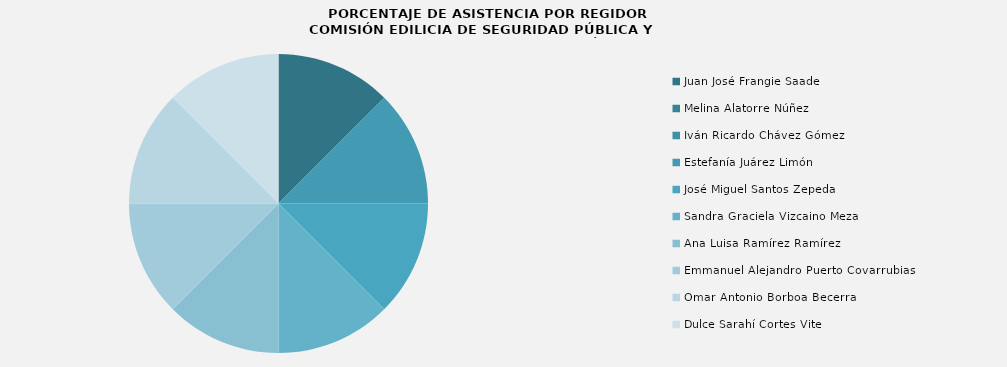
| Category | Series 0 |
|---|---|
| Juan José Frangie Saade | 100 |
| Melina Alatorre Núñez | 0 |
| Iván Ricardo Chávez Gómez | 0 |
| Estefanía Juárez Limón | 100 |
| José Miguel Santos Zepeda | 100 |
| Sandra Graciela Vizcaino Meza | 100 |
| Ana Luisa Ramírez Ramírez | 100 |
| Emmanuel Alejandro Puerto Covarrubias | 100 |
| Omar Antonio Borboa Becerra | 100 |
| Dulce Sarahí Cortes Vite | 100 |